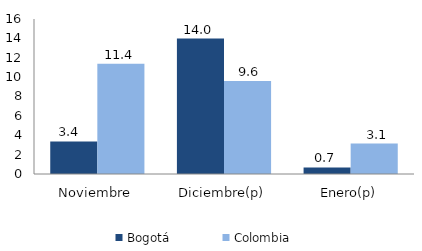
| Category | Bogotá | Colombia |
|---|---|---|
| Noviembre | 3.365 | 11.391 |
| Diciembre(p) | 13.986 | 9.598 |
| Enero(p) | 0.68 | 3.142 |